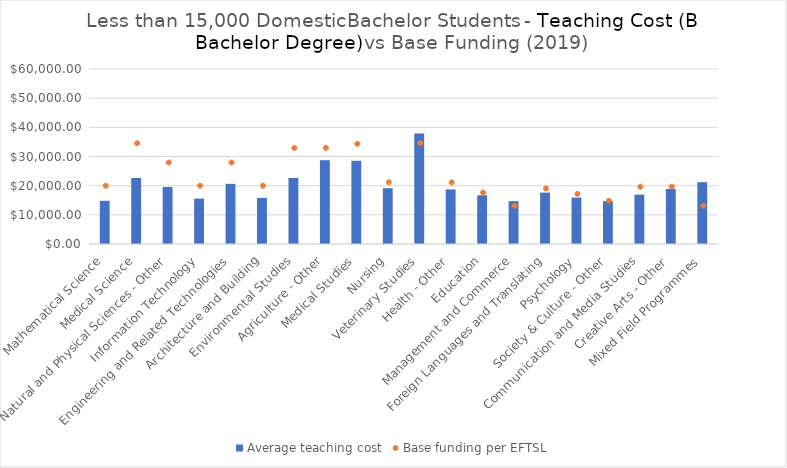
| Category | Average teaching cost |
|---|---|
| Mathematical Science | 14816.458 |
| Medical Science | 22636.812 |
| Natural and Physical Sciences - Other | 19540.202 |
| Information Technology | 15553.608 |
| Engineering and Related Technologies | 20620.315 |
| Architecture and Building | 15799.201 |
| Environmental Studies | 22629.232 |
| Agriculture - Other | 28737.77 |
| Medical Studies | 28536.38 |
| Nursing | 19135.048 |
| Veterinary Studies | 37898.849 |
| Health - Other | 18706.294 |
| Education | 16714.56 |
| Management and Commerce | 14687.103 |
| Foreign Languages and Translating | 17622.933 |
| Psychology | 15903.672 |
| Society & Culture - Other | 14696.72 |
| Communication and Media Studies | 16908.481 |
| Creative Arts - Other | 18861.084 |
| Mixed Field Programmes | 21188.687 |